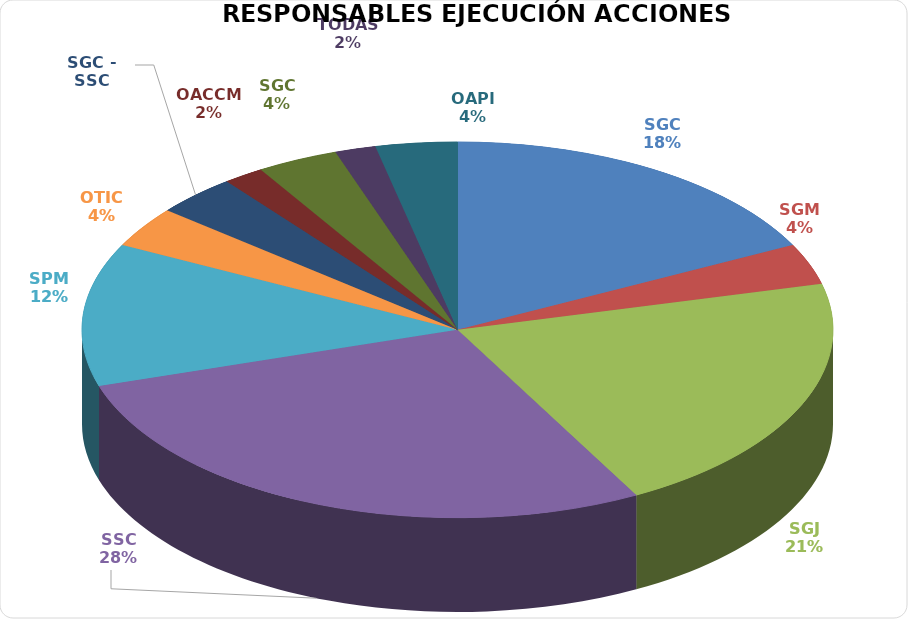
| Category | Series 0 |
|---|---|
| SGC | 10 |
| SGM | 2 |
| SGJ | 12 |
| SSC | 16 |
| SPM | 7 |
| OTIC | 2 |
| SGC - SSC | 2 |
| OACCM | 1 |
| SGC | 2 |
| TODAS | 1 |
| OAPI | 2 |